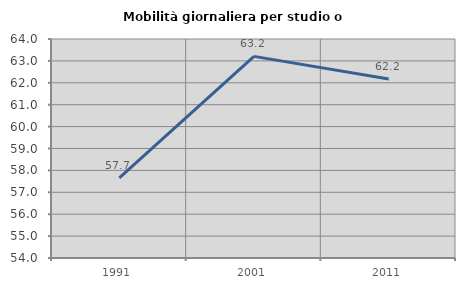
| Category | Mobilità giornaliera per studio o lavoro |
|---|---|
| 1991.0 | 57.662 |
| 2001.0 | 63.208 |
| 2011.0 | 62.173 |